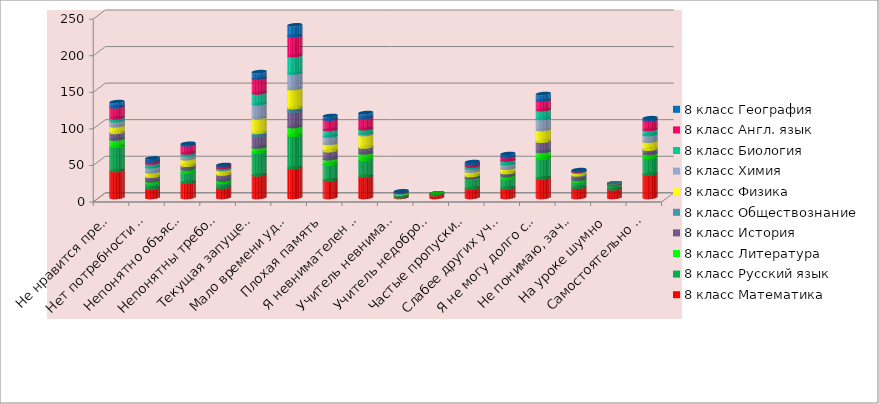
| Category | 8 класс Математика | 8 класс Русский язык | 8 класс Литература | 8 класс История | 8 класс Обществознание | 8 класс Физика | 8 класс Химия | 8 класс Биология | 8 класс Англ. язык | 8 класс География |
|---|---|---|---|---|---|---|---|---|---|---|
| Не нравится предмет | 37 | 33 | 10 | 9 | 0 | 9 | 7 | 4 | 15 | 7 |
| Нет потребности в изучении предмета | 13 | 7 | 3 | 6 | 0 | 6 | 7 | 5 | 3 | 4 |
| Непонятно объяснение учителя | 21 | 14 | 4 | 5 | 0 | 9 | 5 | 3 | 11 | 2 |
| Непонятны требования учителя | 14 | 7 | 3 | 8 | 0 | 6 | 1 | 2 | 3 | 1 |
| Текущая запущенность материала из-за лени | 31 | 31 | 7 | 16 | 4 | 20 | 19 | 15 | 20 | 9 |
| Мало времени уделяю выполнению д/з | 41 | 44 | 12 | 21 | 5 | 26 | 21 | 24 | 27 | 15 |
| Плохая память | 24 | 22 | 7 | 11 | 0 | 10 | 10 | 9 | 14 | 5 |
| Я невнимателен на уроке | 29 | 23 | 9 | 8 | 0 | 17 | 2 | 6 | 15 | 7 |
| Учитель невнимателен  ко мне | 1 | 3 | 0 | 1 | 0 | 1 | 0 | 1 | 1 | 1 |
| Учитель недоброжелателен ко мне | 4 | 2 | 0 | 0 | 0 | 0 | 0 | 0 | 0 | 0 |
| Частые пропуски уроков | 13 | 13 | 1 | 3 | 0 | 6 | 4 | 3 | 3 | 3 |
| Слабее других учеников в классе | 13 | 13 | 4 | 4 | 0 | 6 | 6 | 5 | 5 | 4 |
| Я не могу долго сосредоточивать внимание | 27 | 27 | 9 | 14 | 0 | 16 | 15 | 12 | 13 | 9 |
| Не понимаю, зачем нужны  эти знания | 14 | 8 | 3 | 6 | 0 | 4 | 0 | 1 | 1 | 1 |
| На уроке шумно | 12 | 6 | 0 | 2 | 0 | 0 | 0 | 0 | 0 | 0 |
| Самостоятельно не справляюсь – нужна помощь   | 32 | 23 | 5 | 6 | 0 | 11 | 9 | 7 | 13 | 3 |